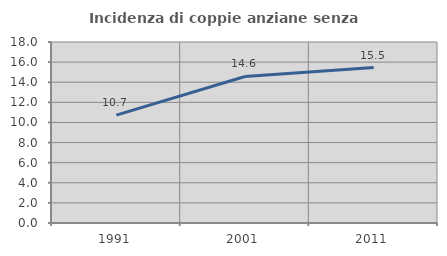
| Category | Incidenza di coppie anziane senza figli  |
|---|---|
| 1991.0 | 10.729 |
| 2001.0 | 14.574 |
| 2011.0 | 15.458 |